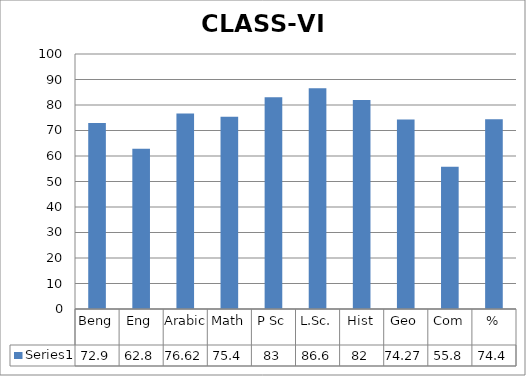
| Category | Series 0 |
|---|---|
| Beng | 72.9 |
| Eng | 62.8 |
| Arabic | 76.62 |
| Math | 75.4 |
| P Sc | 83 |
| L.Sc. | 86.6 |
| Hist | 82 |
| Geo | 74.27 |
| Com | 55.8 |
| % | 74.4 |